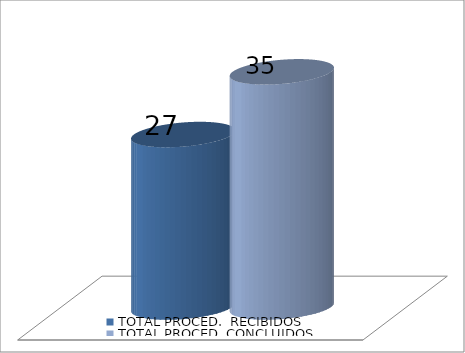
| Category | TOTAL PROCED.  RECIBIDOS | TOTAL PROCED. CONCLUIDOS |
|---|---|---|
| 0 | 27 | 35 |